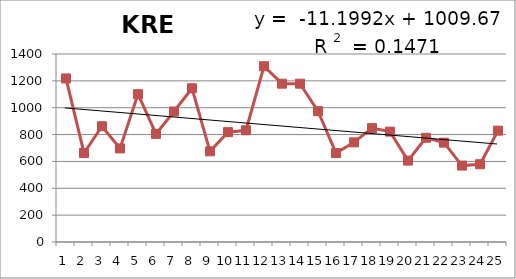
| Category | 1988-2012 |
|---|---|
| 0 | 1218 |
| 1 | 663 |
| 2 | 862 |
| 3 | 697 |
| 4 | 1101 |
| 5 | 805 |
| 6 | 972 |
| 7 | 1145 |
| 8 | 675 |
| 9 | 818 |
| 10 | 832 |
| 11 | 1309 |
| 12 | 1179 |
| 13 | 1179 |
| 14 | 974 |
| 15 | 662 |
| 16 | 742 |
| 17 | 848 |
| 18 | 822 |
| 19 | 606 |
| 20 | 776 |
| 21 | 740 |
| 22 | 569 |
| 23 | 579 |
| 24 | 829 |